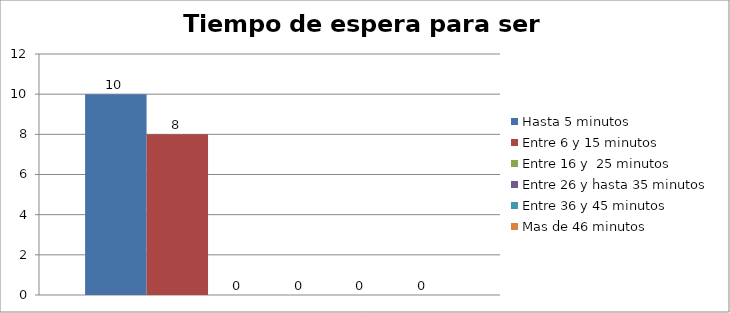
| Category | Hasta 5 minutos | Entre 6 y 15 minutos  | Entre 16 y  25 minutos | Entre 26 y hasta 35 minutos | Entre 36 y 45 minutos  | Mas de 46 minutos |
|---|---|---|---|---|---|---|
| 0 | 10 | 8 | 0 | 0 | 0 | 0 |